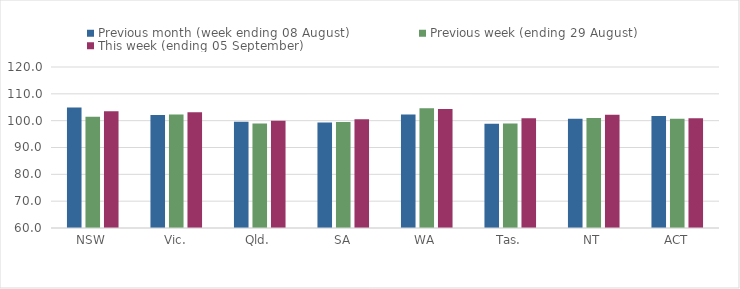
| Category | Previous month (week ending 08 August) | Previous week (ending 29 August) | This week (ending 05 September) |
|---|---|---|---|
| NSW | 104.88 | 101.5 | 103.48 |
| Vic. | 102.09 | 102.27 | 103.12 |
| Qld. | 99.63 | 98.93 | 99.96 |
| SA | 99.28 | 99.49 | 100.53 |
| WA | 102.3 | 104.59 | 104.37 |
| Tas. | 98.89 | 98.99 | 100.87 |
| NT | 100.72 | 100.97 | 102.25 |
| ACT | 101.76 | 100.7 | 100.92 |